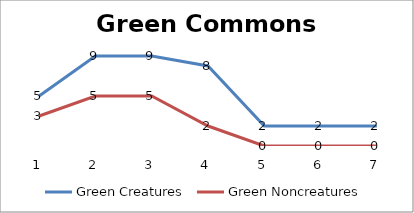
| Category | Green Creatures | Green Noncreatures |
|---|---|---|
| 0 | 5 | 3 |
| 1 | 9 | 5 |
| 2 | 9 | 5 |
| 3 | 8 | 2 |
| 4 | 2 | 0 |
| 5 | 2 | 0 |
| 6 | 2 | 0 |